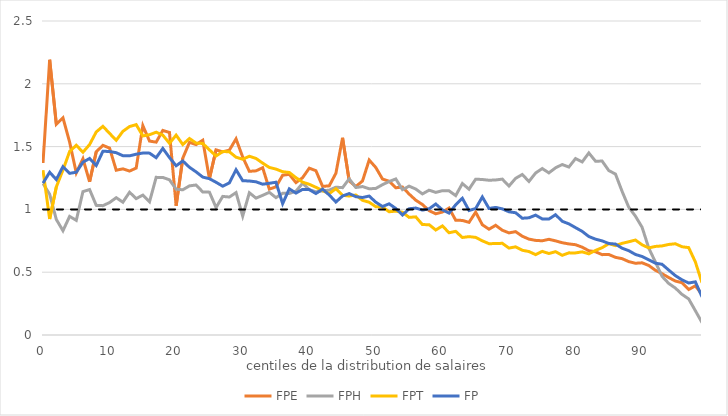
| Category | FPE | FPH | FPT | FP | Series 0 |
|---|---|---|---|---|---|
| 0.0 | 1.369 | 1.207 | 1.312 | 1.209 | 1 |
| 1.0 | 2.191 | 1.121 | 0.923 | 1.296 | 1 |
| 2.0 | 1.678 | 0.92 | 1.179 | 1.238 | 1 |
| 3.0 | 1.729 | 0.83 | 1.314 | 1.341 | 1 |
| 4.0 | 1.536 | 0.944 | 1.461 | 1.287 | 1 |
| 5.0 | 1.291 | 0.913 | 1.511 | 1.296 | 1 |
| 6.0 | 1.404 | 1.142 | 1.455 | 1.376 | 1 |
| 7.0 | 1.22 | 1.158 | 1.516 | 1.406 | 1 |
| 8.0 | 1.459 | 1.032 | 1.617 | 1.35 | 1 |
| 9.0 | 1.51 | 1.03 | 1.661 | 1.463 | 1 |
| 10.0 | 1.488 | 1.055 | 1.605 | 1.461 | 1 |
| 11.0 | 1.312 | 1.093 | 1.55 | 1.451 | 1 |
| 12.0 | 1.323 | 1.057 | 1.621 | 1.428 | 1 |
| 13.0 | 1.305 | 1.137 | 1.66 | 1.426 | 1 |
| 14.0 | 1.329 | 1.086 | 1.675 | 1.439 | 1 |
| 15.0 | 1.667 | 1.114 | 1.585 | 1.449 | 1 |
| 16.0 | 1.544 | 1.06 | 1.595 | 1.448 | 1 |
| 17.0 | 1.535 | 1.255 | 1.615 | 1.412 | 1 |
| 18.0 | 1.629 | 1.255 | 1.591 | 1.486 | 1 |
| 19.0 | 1.612 | 1.236 | 1.526 | 1.413 | 1 |
| 20.0 | 1.029 | 1.161 | 1.591 | 1.347 | 1 |
| 21.0 | 1.407 | 1.156 | 1.516 | 1.386 | 1 |
| 22.0 | 1.534 | 1.187 | 1.564 | 1.335 | 1 |
| 23.0 | 1.516 | 1.194 | 1.528 | 1.299 | 1 |
| 24.0 | 1.551 | 1.139 | 1.525 | 1.257 | 1 |
| 25.0 | 1.245 | 1.137 | 1.474 | 1.244 | 1 |
| 26.0 | 1.474 | 1.015 | 1.425 | 1.216 | 1 |
| 27.0 | 1.458 | 1.103 | 1.461 | 1.185 | 1 |
| 28.0 | 1.472 | 1.098 | 1.459 | 1.211 | 1 |
| 29.0 | 1.562 | 1.134 | 1.416 | 1.316 | 1 |
| 30.0 | 1.417 | 0.947 | 1.399 | 1.229 | 1 |
| 31.0 | 1.303 | 1.133 | 1.423 | 1.226 | 1 |
| 32.0 | 1.307 | 1.09 | 1.406 | 1.22 | 1 |
| 33.0 | 1.332 | 1.112 | 1.368 | 1.201 | 1 |
| 34.0 | 1.161 | 1.136 | 1.334 | 1.208 | 1 |
| 35.0 | 1.18 | 1.094 | 1.321 | 1.216 | 1 |
| 36.0 | 1.272 | 1.128 | 1.3 | 1.046 | 1 |
| 37.0 | 1.279 | 1.127 | 1.294 | 1.164 | 1 |
| 38.0 | 1.213 | 1.145 | 1.253 | 1.13 | 1 |
| 39.0 | 1.253 | 1.208 | 1.217 | 1.159 | 1 |
| 40.0 | 1.328 | 1.158 | 1.2 | 1.157 | 1 |
| 41.0 | 1.308 | 1.14 | 1.176 | 1.126 | 1 |
| 42.0 | 1.183 | 1.147 | 1.149 | 1.161 | 1 |
| 43.0 | 1.187 | 1.153 | 1.126 | 1.115 | 1 |
| 44.0 | 1.288 | 1.177 | 1.165 | 1.059 | 1 |
| 45.0 | 1.57 | 1.173 | 1.112 | 1.107 | 1 |
| 46.0 | 1.227 | 1.243 | 1.107 | 1.126 | 1 |
| 47.0 | 1.182 | 1.174 | 1.115 | 1.101 | 1 |
| 48.0 | 1.226 | 1.182 | 1.072 | 1.095 | 1 |
| 49.0 | 1.393 | 1.164 | 1.057 | 1.106 | 1 |
| 50.0 | 1.333 | 1.167 | 1.022 | 1.057 | 1 |
| 51.0 | 1.242 | 1.197 | 1.02 | 1.023 | 1 |
| 52.0 | 1.224 | 1.222 | 0.981 | 1.044 | 1 |
| 53.0 | 1.172 | 1.243 | 0.986 | 1.008 | 1 |
| 54.0 | 1.178 | 1.157 | 0.977 | 0.955 | 1 |
| 55.0 | 1.122 | 1.185 | 0.937 | 1.005 | 1 |
| 56.0 | 1.073 | 1.162 | 0.94 | 1.011 | 1 |
| 57.0 | 1.039 | 1.123 | 0.879 | 0.994 | 1 |
| 58.0 | 0.99 | 1.153 | 0.879 | 1.005 | 1 |
| 59.0 | 0.965 | 1.136 | 0.836 | 1.043 | 1 |
| 60.0 | 0.979 | 1.149 | 0.868 | 0.997 | 1 |
| 61.0 | 1.011 | 1.148 | 0.814 | 0.97 | 1 |
| 62.0 | 0.914 | 1.11 | 0.825 | 1.037 | 1 |
| 63.0 | 0.912 | 1.206 | 0.776 | 1.089 | 1 |
| 64.0 | 0.897 | 1.161 | 0.783 | 0.991 | 1 |
| 65.0 | 0.978 | 1.241 | 0.777 | 1.007 | 1 |
| 66.0 | 0.878 | 1.238 | 0.75 | 1.099 | 1 |
| 67.0 | 0.842 | 1.232 | 0.727 | 1.007 | 1 |
| 68.0 | 0.873 | 1.234 | 0.728 | 1.016 | 1 |
| 69.0 | 0.834 | 1.241 | 0.73 | 1.004 | 1 |
| 70.0 | 0.813 | 1.186 | 0.692 | 0.981 | 1 |
| 71.0 | 0.823 | 1.247 | 0.702 | 0.973 | 1 |
| 72.0 | 0.787 | 1.278 | 0.675 | 0.93 | 1 |
| 73.0 | 0.763 | 1.222 | 0.665 | 0.933 | 1 |
| 74.0 | 0.753 | 1.29 | 0.64 | 0.954 | 1 |
| 75.0 | 0.75 | 1.325 | 0.666 | 0.924 | 1 |
| 76.0 | 0.762 | 1.291 | 0.649 | 0.923 | 1 |
| 77.0 | 0.749 | 1.331 | 0.664 | 0.958 | 1 |
| 78.0 | 0.735 | 1.357 | 0.634 | 0.905 | 1 |
| 79.0 | 0.725 | 1.337 | 0.654 | 0.885 | 1 |
| 80.0 | 0.719 | 1.405 | 0.654 | 0.855 | 1 |
| 81.0 | 0.699 | 1.378 | 0.662 | 0.825 | 1 |
| 82.0 | 0.671 | 1.449 | 0.646 | 0.784 | 1 |
| 83.0 | 0.663 | 1.384 | 0.673 | 0.763 | 1 |
| 84.0 | 0.64 | 1.384 | 0.695 | 0.749 | 1 |
| 85.0 | 0.641 | 1.309 | 0.727 | 0.728 | 1 |
| 86.0 | 0.618 | 1.282 | 0.712 | 0.724 | 1 |
| 87.0 | 0.608 | 1.143 | 0.73 | 0.691 | 1 |
| 88.0 | 0.584 | 1.017 | 0.742 | 0.671 | 1 |
| 89.0 | 0.571 | 0.946 | 0.756 | 0.641 | 1 |
| 90.0 | 0.575 | 0.858 | 0.718 | 0.625 | 1 |
| 91.0 | 0.554 | 0.692 | 0.693 | 0.599 | 1 |
| 92.0 | 0.515 | 0.581 | 0.705 | 0.572 | 1 |
| 93.0 | 0.488 | 0.467 | 0.709 | 0.563 | 1 |
| 94.0 | 0.458 | 0.41 | 0.721 | 0.517 | 1 |
| 95.0 | 0.429 | 0.373 | 0.726 | 0.473 | 1 |
| 96.0 | 0.416 | 0.323 | 0.703 | 0.439 | 1 |
| 97.0 | 0.362 | 0.287 | 0.696 | 0.414 | 1 |
| 98.0 | 0.392 | 0.194 | 0.582 | 0.423 | 1 |
| 99.0 | 0.323 | 0.099 | 0.416 | 0.304 | 1 |